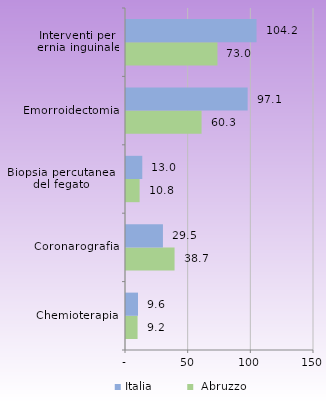
| Category |  Abruzzo | Italia |
|---|---|---|
| Chemioterapia | 9.228 | 9.567 |
| Coronarografia | 38.741 | 29.469 |
| Biopsia percutanea 
del fegato | 10.839 | 12.991 |
| Emorroidectomia | 60.287 | 97.066 |
| Interventi per
 ernia inguinale | 72.979 | 104.162 |